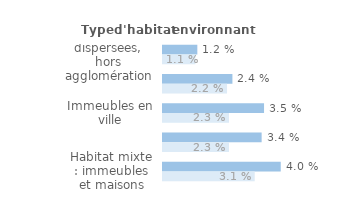
| Category | Series 1 | Series 0 |
|---|---|---|
| Maisons dispersées, hors agglomération | 0.012 | 0.011 |
| Maisons en lotissement, en quartier pavillonnaire | 0.024 | 0.022 |
| Immeubles en ville | 0.035 | 0.023 |
| Immeubles en cité ou grand ensemble | 0.034 | 0.023 |
| Habitat mixte : immeubles et maisons | 0.04 | 0.031 |